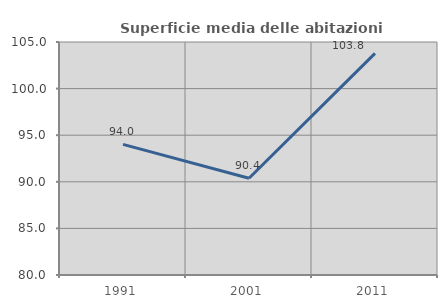
| Category | Superficie media delle abitazioni occupate |
|---|---|
| 1991.0 | 94.017 |
| 2001.0 | 90.379 |
| 2011.0 | 103.785 |